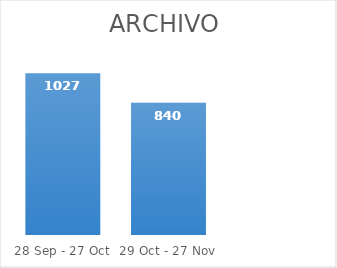
| Category | Series 0 |
|---|---|
| 28 Sep - 27 Oct | 1027 |
| 29 Oct - 27 Nov | 840 |